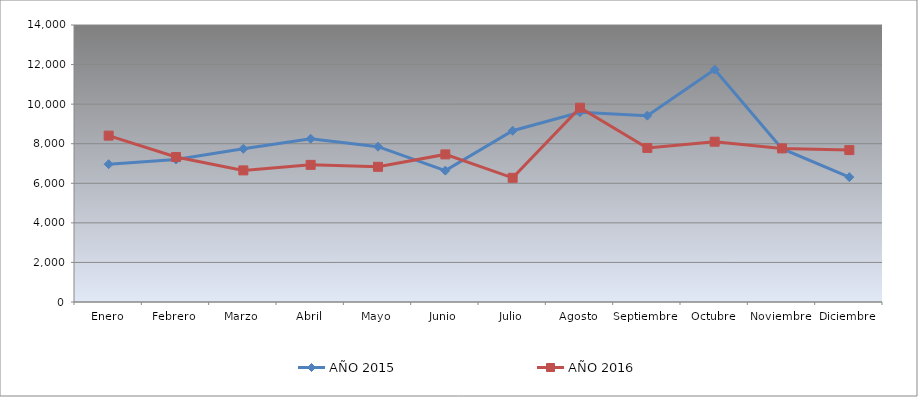
| Category | AÑO 2015 | AÑO 2016 |
|---|---|---|
| Enero | 6963.729 | 8408.193 |
| Febrero | 7201.906 | 7326.873 |
| Marzo | 7742.45 | 6652.32 |
| Abril | 8250.9 | 6931.124 |
| Mayo | 7849.715 | 6833.246 |
| Junio | 6641.092 | 7459.92 |
| Julio | 8655.463 | 6276.908 |
| Agosto | 9593.814 | 9819.163 |
| Septiembre | 9418.982 | 7787.027 |
| Octubre | 11745.855 | 8101.847 |
| Noviembre | 7750.052 | 7764.147 |
| Diciembre | 6310.853 | 7676.861 |